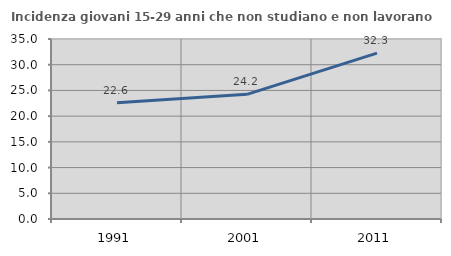
| Category | Incidenza giovani 15-29 anni che non studiano e non lavorano  |
|---|---|
| 1991.0 | 22.581 |
| 2001.0 | 24.242 |
| 2011.0 | 32.258 |